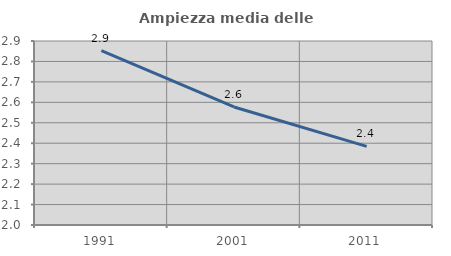
| Category | Ampiezza media delle famiglie |
|---|---|
| 1991.0 | 2.853 |
| 2001.0 | 2.577 |
| 2011.0 | 2.384 |